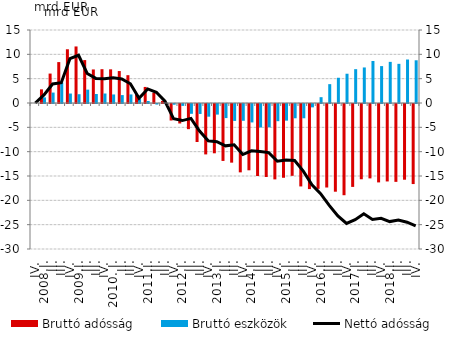
| Category | Bruttó adósság  | Bruttó eszközök |
|---|---|---|
| IV. | 0 | 0 |
| 2008.I. | 2.805 | 1.155 |
| II. | 6.047 | 2.144 |
| III. | 8.406 | 4.231 |
| IV. | 11.042 | 1.944 |
| 2009.I. | 11.619 | 1.806 |
| II. | 8.818 | 2.746 |
| III. | 6.896 | 1.845 |
| IV. | 6.949 | 1.95 |
| 2010. I. | 6.917 | 1.755 |
| II. | 6.567 | 1.624 |
| III. | 5.717 | 1.759 |
| IV. | 1.77 | 0.814 |
| 2011.I. | 3.302 | 0.409 |
| II. | 2.097 | -0.111 |
| III. | 0.433 | 0.067 |
| IV. | -3.394 | -0.148 |
| 2012.I. | -4 | -0.387 |
| II. | -5.171 | -2.014 |
| III. | -7.808 | -2.044 |
| IV. | -10.358 | -2.605 |
| 2013.I. | -10.129 | -2.176 |
| II. | -11.7 | -2.894 |
| III. | -12.051 | -3.475 |
| IV. | -14.044 | -3.451 |
| 2014.I. | -13.623 | -3.789 |
| II. | -14.796 | -4.82 |
| III. | -14.997 | -4.797 |
| IV. | -15.49 | -3.532 |
| 2015.I. | -15.157 | -3.419 |
| II. | -14.758 | -2.933 |
| III. | -16.939 | -2.933 |
| IV. | -17.484 | -0.69 |
| 2016.I. | -17.44 | 1.197 |
| II. | -17.159 | 3.873 |
| III. | -18.021 | 5.187 |
| IV. | -18.744 | 6.014 |
| 2017.I. | -17.034 | 6.951 |
| II. | -15.468 | 7.303 |
| III. | -15.285 | 8.635 |
| IV. | -16.111 | 7.581 |
| 2018.I. | -15.914 | 8.452 |
| II. | -15.999 | 8.047 |
| III. | -15.559 | 8.936 |
| IV. | -16.45 | 8.777 |